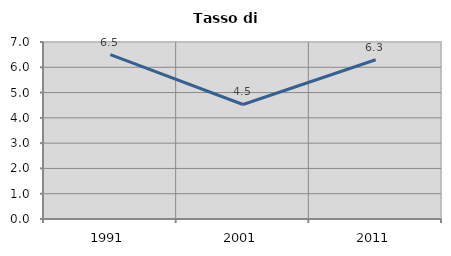
| Category | Tasso di disoccupazione   |
|---|---|
| 1991.0 | 6.498 |
| 2001.0 | 4.529 |
| 2011.0 | 6.298 |